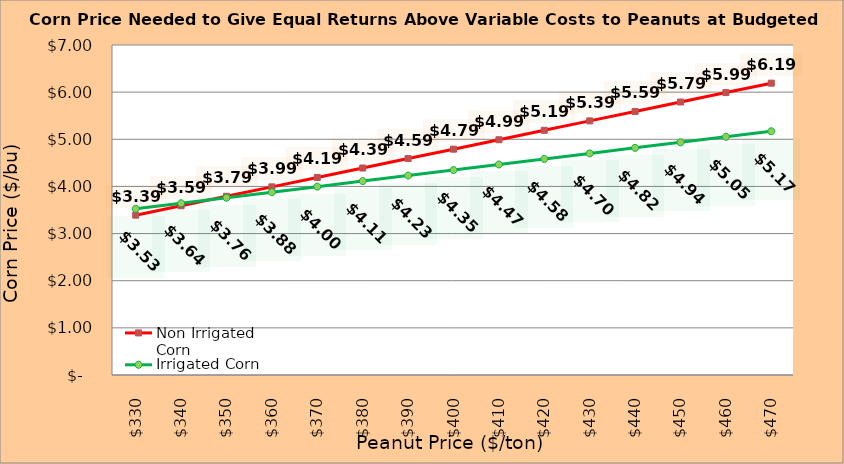
| Category | Non Irrigated Corn | Irrigated Corn |
|---|---|---|
| 330.0 | 3.391 | 3.526 |
| 340.0 | 3.591 | 3.643 |
| 350.0 | 3.791 | 3.761 |
| 360.0 | 3.991 | 3.878 |
| 370.0 | 4.191 | 3.996 |
| 380.0 | 4.391 | 4.113 |
| 390.0 | 4.591 | 4.231 |
| 400.0 | 4.791 | 4.348 |
| 410.0 | 4.991 | 4.466 |
| 420.0 | 5.191 | 4.583 |
| 430.0 | 5.391 | 4.701 |
| 440.0 | 5.591 | 4.818 |
| 450.0 | 5.791 | 4.936 |
| 460.0 | 5.991 | 5.053 |
| 470.0 | 6.191 | 5.171 |